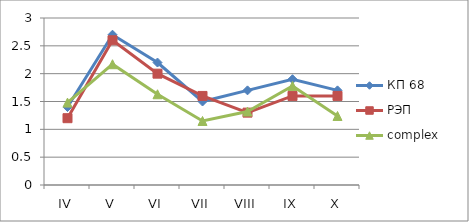
| Category | КП 68 | РЭП  | complex |
|---|---|---|---|
| IV | 1.4 | 1.2 | 1.48 |
| V | 2.7 | 2.6 | 2.17 |
| VI | 2.2 | 2 | 1.63 |
| VII | 1.5 | 1.6 | 1.15 |
| VIII | 1.7 | 1.3 | 1.32 |
| IX | 1.9 | 1.6 | 1.78 |
| X | 1.7 | 1.6 | 1.24 |